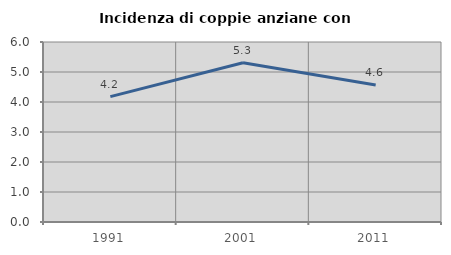
| Category | Incidenza di coppie anziane con figli |
|---|---|
| 1991.0 | 4.178 |
| 2001.0 | 5.311 |
| 2011.0 | 4.566 |